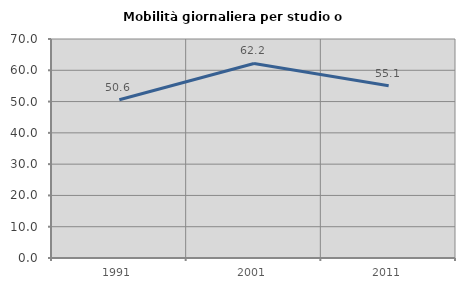
| Category | Mobilità giornaliera per studio o lavoro |
|---|---|
| 1991.0 | 50.589 |
| 2001.0 | 62.19 |
| 2011.0 | 55.087 |